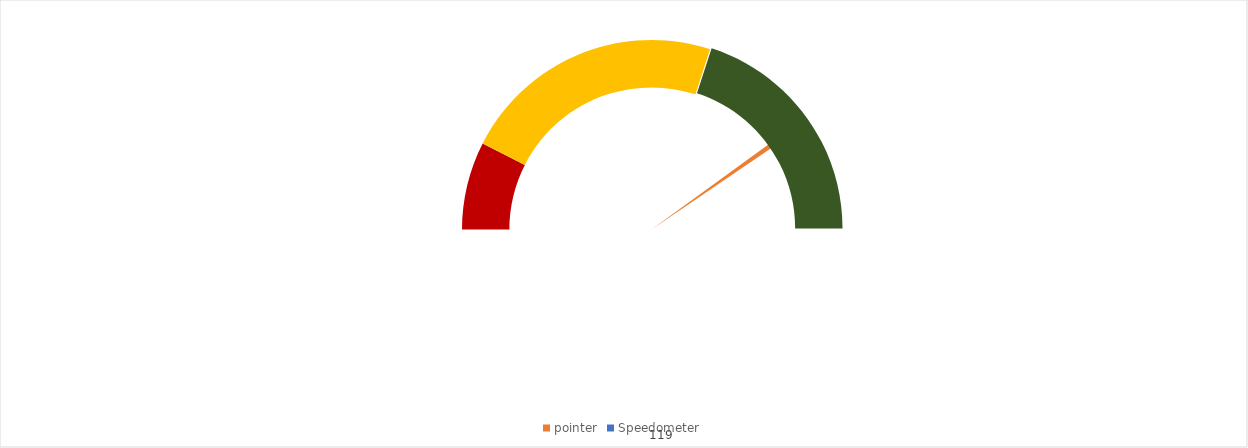
| Category | pointer |
|---|---|
| 0 | 80 |
| 1 | 1 |
| 2 | 119 |